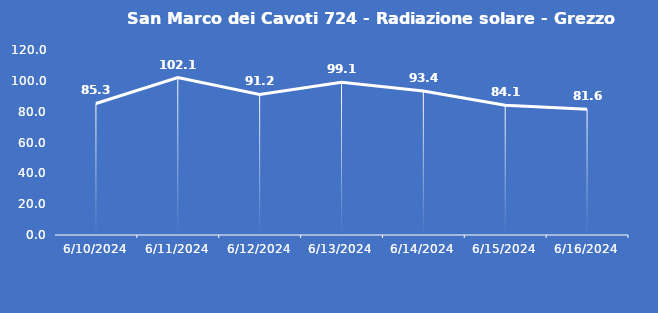
| Category | San Marco dei Cavoti 724 - Radiazione solare - Grezzo (W/m2) |
|---|---|
| 6/10/24 | 85.3 |
| 6/11/24 | 102.1 |
| 6/12/24 | 91.2 |
| 6/13/24 | 99.1 |
| 6/14/24 | 93.4 |
| 6/15/24 | 84.1 |
| 6/16/24 | 81.6 |